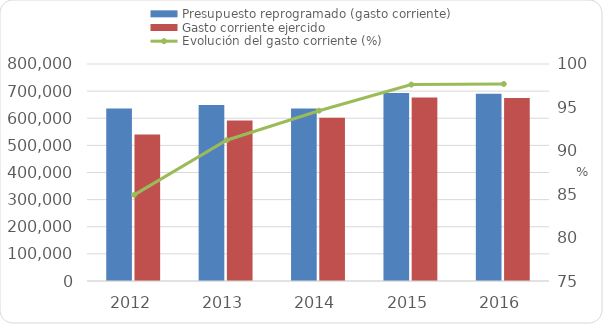
| Category | Presupuesto reprogramado (gasto corriente) | Gasto corriente ejercido |
|---|---|---|
| 2012 | 635864.8 | 540007.3 |
| 2013 | 648900.7 | 591915.7 |
| 2014 | 636228.2 | 601977.4 |
| 2015 | 692840.462 | 676403.338 |
| 2016 | 690154.161 | 674285.7 |